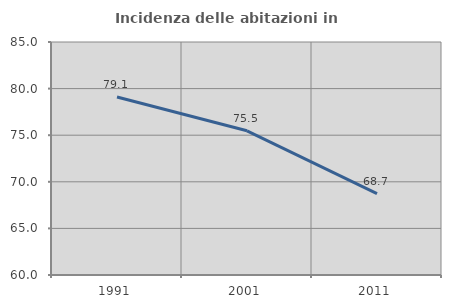
| Category | Incidenza delle abitazioni in proprietà  |
|---|---|
| 1991.0 | 79.104 |
| 2001.0 | 75.472 |
| 2011.0 | 68.728 |